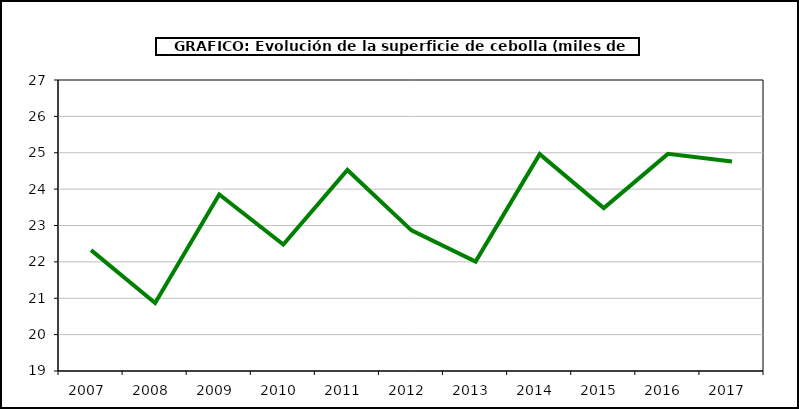
| Category | superficie |
|---|---|
| 2007.0 | 22.324 |
| 2008.0 | 20.868 |
| 2009.0 | 23.851 |
| 2010.0 | 22.478 |
| 2011.0 | 24.526 |
| 2012.0 | 22.867 |
| 2013.0 | 22.008 |
| 2014.0 | 24.961 |
| 2015.0 | 23.48 |
| 2016.0 | 24.969 |
| 2017.0 | 24.762 |